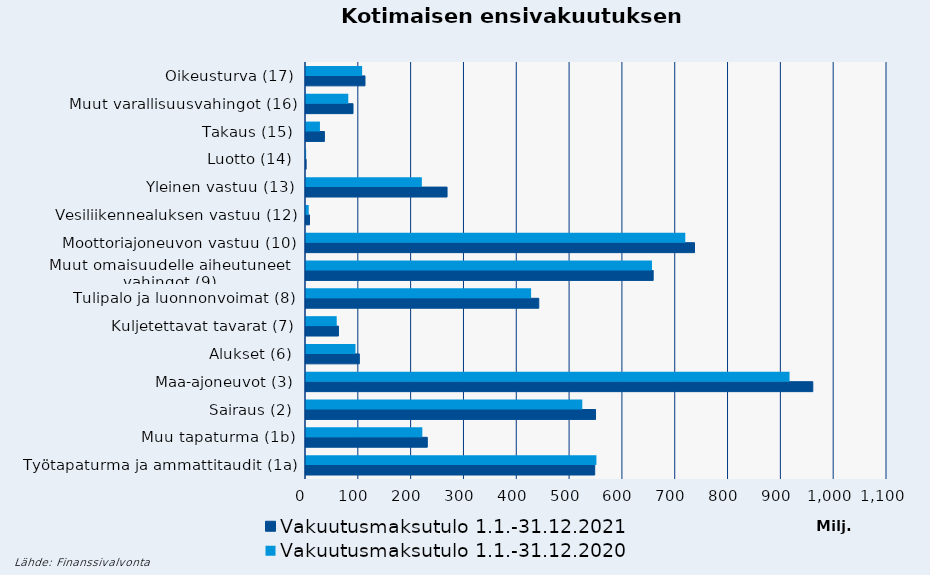
| Category | Vakuutusmaksutulo |
|---|---|
| Työtapaturma ja ammattitaudit (1a) | 549843.422 |
| Muu tapaturma (1b) | 220226.856 |
| Sairaus (2) | 523129.933 |
| Maa-ajoneuvot (3) | 915498.982 |
| Alukset (6) | 93668.316 |
| Kuljetettavat tavarat (7) | 58177.492 |
| Tulipalo ja luonnonvoimat (8) | 426182.783 |
| Muut omaisuudelle aiheutuneet 
vahingot (9) | 655020.47 |
| Moottoriajoneuvon vastuu (10) | 718074.556 |
| Vesiliikennealuksen vastuu (12) | 5170.486 |
| Yleinen vastuu (13) | 219343.744 |
| Luotto (14) | 250.786 |
| Takaus (15) | 26408.731 |
| Muut varallisuusvahingot (16) | 80054.151 |
| Oikeusturva (17) | 106279.304 |